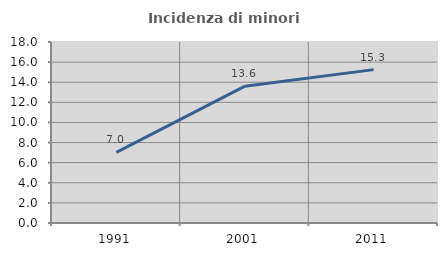
| Category | Incidenza di minori stranieri |
|---|---|
| 1991.0 | 7.025 |
| 2001.0 | 13.609 |
| 2011.0 | 15.252 |